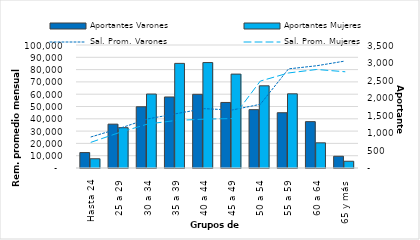
| Category | Aportantes Varones | Aportantes Mujeres |
|---|---|---|
| Hasta 24 | 439 | 263 |
| 25 a 29 | 1248 | 1147 |
| 30 a 34 | 1742 | 2104 |
| 35 a 39 | 2021 | 2977 |
| 40 a 44 | 2097 | 3000 |
| 45 a 49 | 1865 | 2672 |
| 50 a 54 | 1660 | 2339 |
| 55 a 59 | 1573 | 2111 |
| 60 a 64 | 1319 | 716 |
| 65 y más | 334 | 192 |